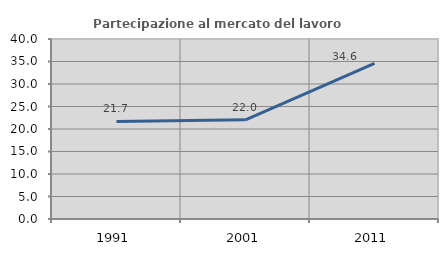
| Category | Partecipazione al mercato del lavoro  femminile |
|---|---|
| 1991.0 | 21.683 |
| 2001.0 | 22.034 |
| 2011.0 | 34.605 |